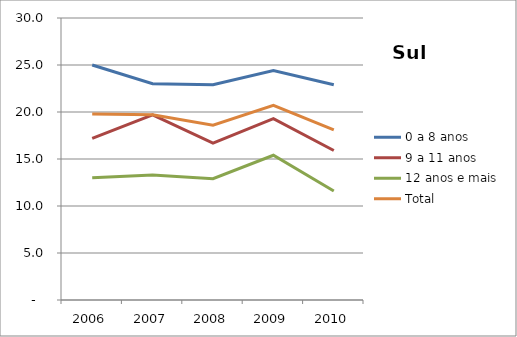
| Category | 0 a 8 anos | 9 a 11 anos | 12 anos e mais | Total |
|---|---|---|---|---|
| 2006.0 | 25 | 17.2 | 13 | 19.8 |
| 2007.0 | 23 | 19.7 | 13.3 | 19.7 |
| 2008.0 | 22.9 | 16.7 | 12.9 | 18.6 |
| 2009.0 | 24.4 | 19.3 | 15.4 | 20.7 |
| 2010.0 | 22.9 | 15.9 | 11.6 | 18.1 |